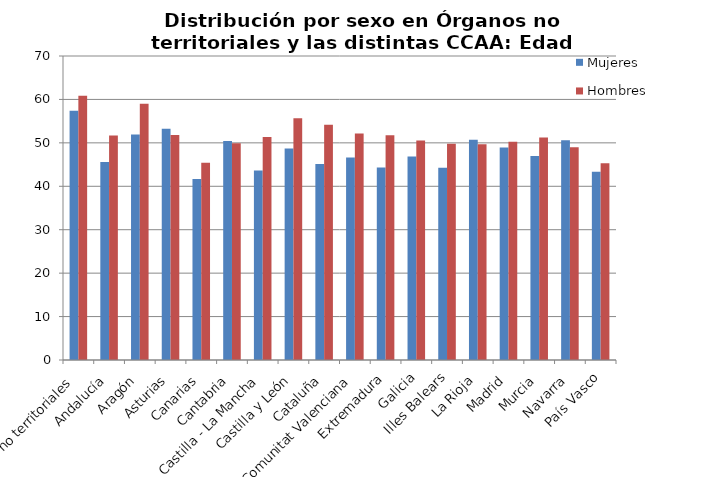
| Category | Mujeres | Hombres |
|---|---|---|
| Órganos no territoriales | 57.41 | 60.87 |
| Andalucía | 45.62 | 51.67 |
| Aragón | 51.92 | 59 |
| Asturias | 53.24 | 51.83 |
| Canarias | 41.65 | 45.43 |
| Cantabria | 50.41 | 49.9 |
| Castilla - La Mancha | 43.64 | 51.37 |
| Castilla y León | 48.7 | 55.66 |
| Cataluña | 45.13 | 54.17 |
| Comunitat Valenciana | 46.63 | 52.13 |
| Extremadura | 44.32 | 51.77 |
| Galicia | 46.85 | 50.52 |
| Illes Balears | 44.24 | 49.77 |
| La Rioja | 50.71 | 49.67 |
| Madrid | 48.93 | 50.23 |
| Murcia | 46.95 | 51.26 |
| Navarra | 50.6 | 49 |
| País Vasco | 43.36 | 45.33 |